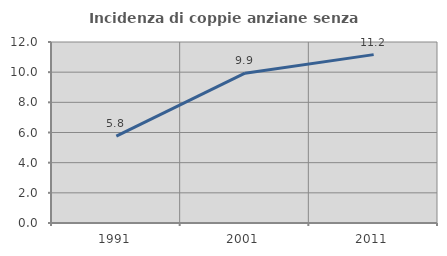
| Category | Incidenza di coppie anziane senza figli  |
|---|---|
| 1991.0 | 5.754 |
| 2001.0 | 9.93 |
| 2011.0 | 11.162 |